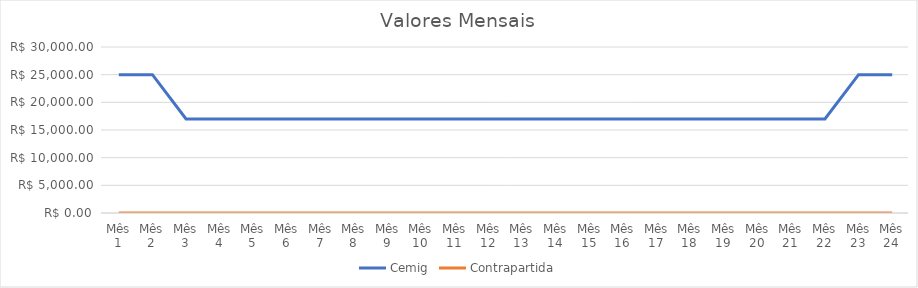
| Category | Cemig | Contrapartida |
|---|---|---|
| Mês 1 | 25000 | 0 |
| Mês 2 | 25000 | 0 |
| Mês 3 | 17000 | 0 |
| Mês 4 | 17000 | 0 |
| Mês 5 | 17000 | 0 |
| Mês 6 | 17000 | 0 |
| Mês 7 | 17000 | 0 |
| Mês 8 | 17000 | 0 |
| Mês 9 | 17000 | 0 |
| Mês 10 | 17000 | 0 |
| Mês 11 | 17000 | 0 |
| Mês 12 | 17000 | 0 |
| Mês 13 | 17000 | 0 |
| Mês 14 | 17000 | 0 |
| Mês 15 | 17000 | 0 |
| Mês 16 | 17000 | 0 |
| Mês 17 | 17000 | 0 |
| Mês 18 | 17000 | 0 |
| Mês 19 | 17000 | 0 |
| Mês 20 | 17000 | 0 |
| Mês 21 | 17000 | 0 |
| Mês 22 | 17000 | 0 |
| Mês 23 | 25000 | 0 |
| Mês 24 | 25000 | 0 |